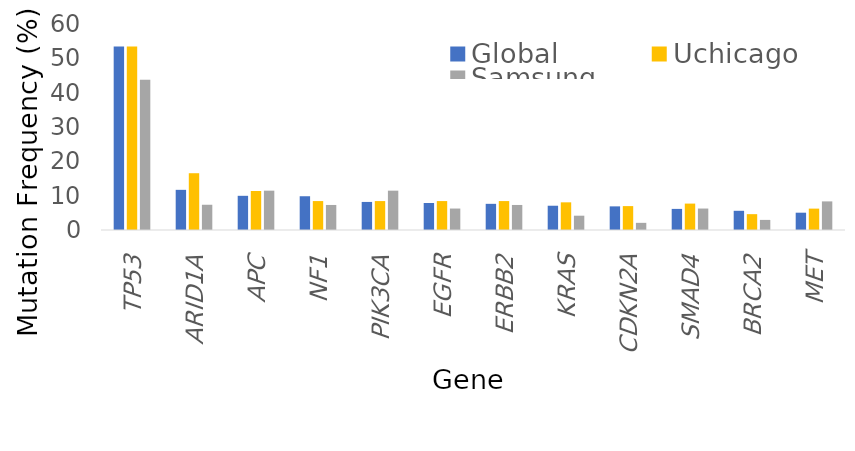
| Category | Global | Uchicago | Samsung |
|---|---|---|---|
| TP53 | 53.473 | 53.48 | 43.75 |
| ARID1A | 11.697 | 16.538 | 7.353 |
| APC | 9.957 | 11.355 | 11.458 |
| NF1 | 9.834 | 8.425 | 7.292 |
| PIK3CA | 8.175 | 8.425 | 11.458 |
| EGFR | 7.867 | 8.425 | 6.25 |
| ERBB2 | 7.621 | 8.425 | 7.292 |
| KRAS | 7.068 | 8.059 | 4.167 |
| CDKN2A | 6.884 | 6.96 | 2.083 |
| SMAD4 | 6.146 | 7.692 | 6.25 |
| BRCA2 | 5.594 | 4.615 | 2.941 |
| MET | 5.04 | 6.227 | 8.333 |